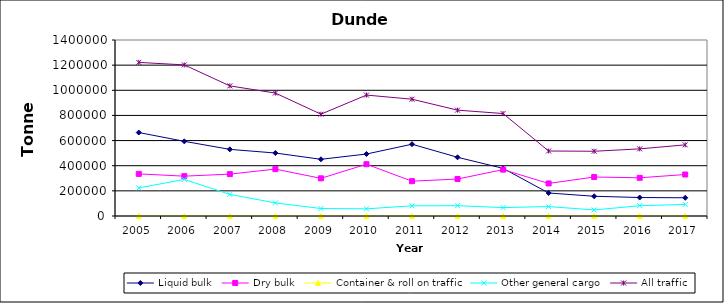
| Category | Liquid bulk | Dry bulk | Container & roll on traffic | Other general cargo | All traffic |
|---|---|---|---|---|---|
| 2005.0 | 664000 | 335000 | 0 | 223000 | 1222000 |
| 2006.0 | 594000 | 317000 | 0 | 291000 | 1202000 |
| 2007.0 | 530000 | 333000 | 0 | 172000 | 1035000 |
| 2008.0 | 501000 | 373000 | 0 | 104000 | 978000 |
| 2009.0 | 450942 | 299559 | 0 | 59441 | 809942 |
| 2010.0 | 493000 | 412000 | 0 | 57000 | 962000 |
| 2011.0 | 571000 | 277000 | 0 | 81000 | 929000 |
| 2012.0 | 467000 | 294000 | 0 | 82000 | 842000 |
| 2013.0 | 379000 | 369000 | 0 | 67000 | 815000 |
| 2014.0 | 183000 | 259000 | 0 | 75000 | 517000 |
| 2015.0 | 157000 | 310000 | 0 | 48000 | 515000 |
| 2016.0 | 147000 | 304000 | 0 | 82000 | 534000 |
| 2017.0 | 145000 | 330000 | 0 | 92000 | 566000 |